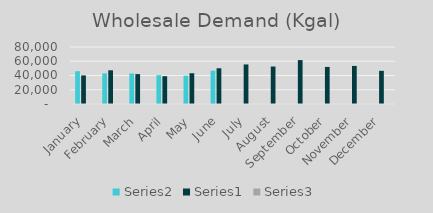
| Category | Series 1 | Series 0 | Series 2 |
|---|---|---|---|
| January | 46042 | 40140 | 1.147 |
| February | 42951.714 | 47315 | 0.908 |
| March | 42828.697 | 41977 | 1.02 |
| April | 40411.734 | 38996.46 | 1.036 |
| May | 39719.105 | 43187.656 | 0.92 |
| June | 46763.685 | 50131.03 | 0.933 |
| July | 0 | 55518.584 | 0 |
| August | 0 | 52591.348 | 0 |
| September | 0 | 61625.007 | 0 |
| October | 0 | 52042.125 | 0 |
| November | 0 | 53432.969 | 0 |
| December | 0 | 46567.149 | 0 |